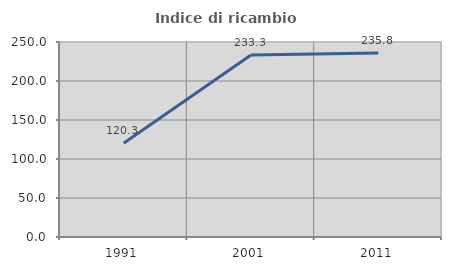
| Category | Indice di ricambio occupazionale  |
|---|---|
| 1991.0 | 120.28 |
| 2001.0 | 233.333 |
| 2011.0 | 235.838 |